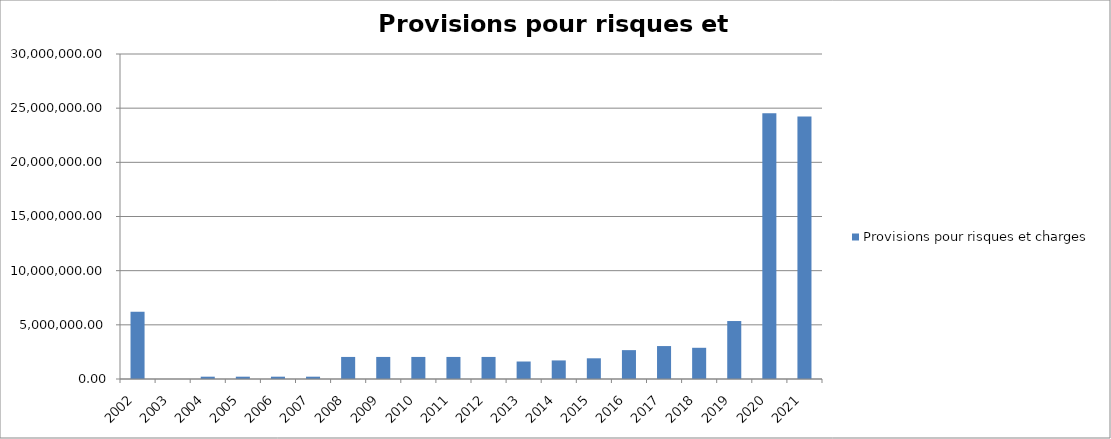
| Category | Provisions pour risques et charges |
|---|---|
| 2002.0 | 6197338.12 |
| 2003.0 | 0 |
| 2004.0 | 213929 |
| 2005.0 | 213929 |
| 2006.0 | 213929 |
| 2007.0 | 213929 |
| 2008.0 | 2036397.48 |
| 2009.0 | 2036397.48 |
| 2010.0 | 2036397.48 |
| 2011.0 | 2036397.48 |
| 2012.0 | 2036397.48 |
| 2013.0 | 1614756.54 |
| 2014.0 | 1714756.54 |
| 2015.0 | 1910908.31 |
| 2016.0 | 2664756.54 |
| 2017.0 | 3040367.33 |
| 2018.0 | 2880930.35 |
| 2019.0 | 5350590.96 |
| 2020.0 | 24532917.42 |
| 2021.0 | 24232917.42 |